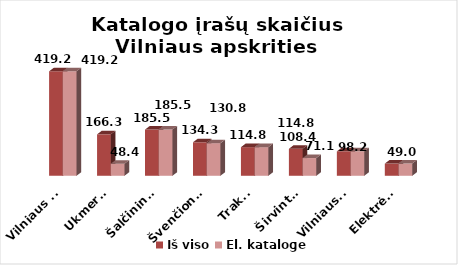
| Category | Iš viso | El. kataloge |
|---|---|---|
| Vilniaus m. | 419.2 | 419.2 |
| Ukmergė | 166.3 | 48.4 |
| Šalčininkai | 185.5 | 185.5 |
| Švenčionys | 134.3 | 130.8 |
| Trakai | 114.8 | 114.8 |
| Širvintos | 108.4 | 71.1 |
| Vilniaus r. | 98.2 | 98.2 |
| Elektrėnai | 49 | 49 |